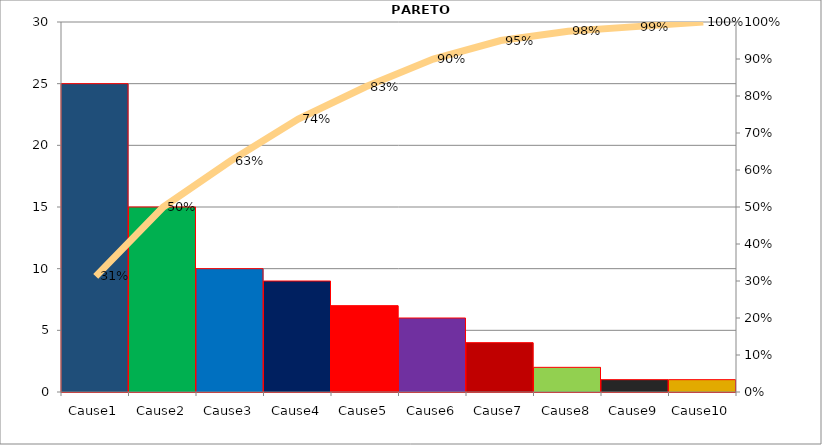
| Category | Quantity |
|---|---|
| Cause1 | 25 |
| Cause2 | 15 |
| Cause3 | 10 |
| Cause4 | 9 |
| Cause5 | 7 |
| Cause6 | 6 |
| Cause7 | 4 |
| Cause8 | 2 |
| Cause9 | 1 |
| Cause10 | 1 |